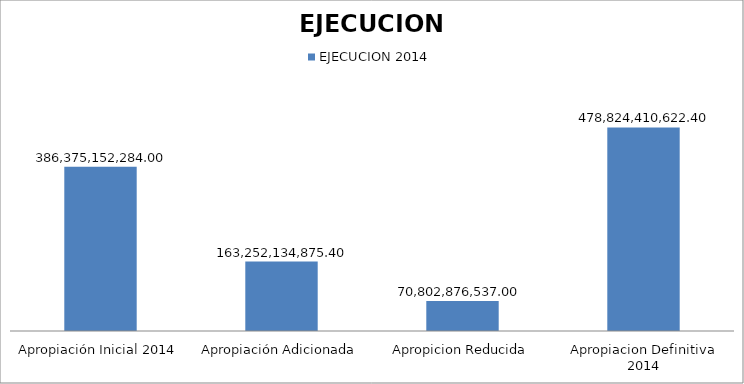
| Category | EJECUCION 2014 |
|---|---|
| Apropiación Inicial 2014 | 386375152284 |
| Apropiación Adicionada | 163252134875.4 |
| Apropicion Reducida | 70802876537 |
| Apropiacion Definitiva 2014 | 478824410622.4 |